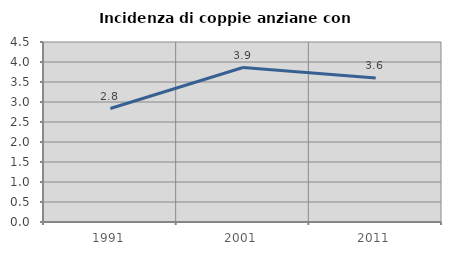
| Category | Incidenza di coppie anziane con figli |
|---|---|
| 1991.0 | 2.837 |
| 2001.0 | 3.862 |
| 2011.0 | 3.599 |